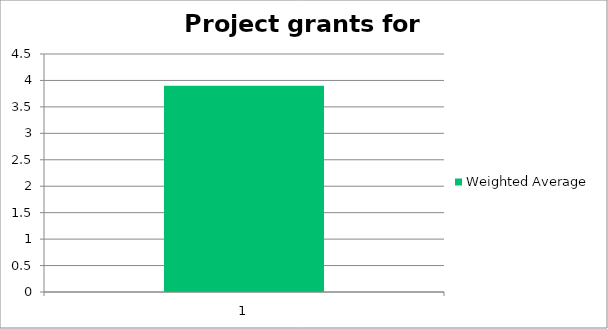
| Category | Weighted Average |
|---|---|
| 1.0 | 3.9 |